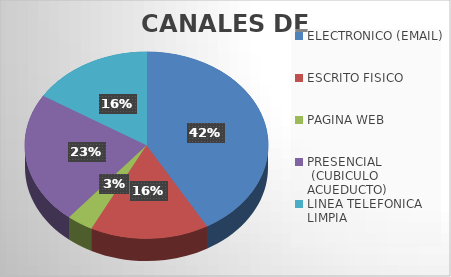
| Category | Series 0 |
|---|---|
| ELECTRONICO (EMAIL) | 419 |
| ESCRITO FISICO  | 158 |
| PAGINA WEB                               | 35 |
| PRESENCIAL                    (CUBICULO ACUEDUCTO) | 230 |
| LINEA TELEFONICA LIMPIA | 162 |